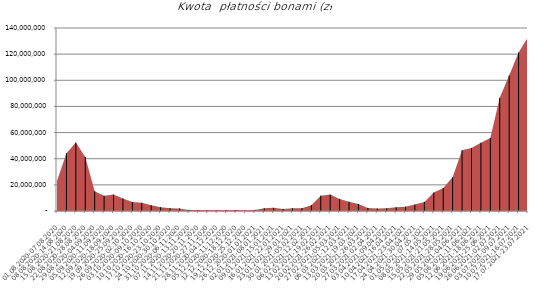
| Category | Kwota płatności bonami (zł) |
|---|---|
| 01.08.2020-07.08.2020 | 22962396.11 |
| 08.08.2020-14.08.2020 | 44134317.06 |
| 15.08.2020-21.08.2020 | 52334816.93 |
| 22.08.2020-28.08.2020 | 41223224.44 |
| 29.08.2020-04.09.2020 | 15089118.73 |
| 05.09.2020-11.09.2020 | 11625392.1 |
| 12.09.2020-18.09.2020 | 12529523.18 |
| 19.09.2020-25.09.2020 | 9513473.35 |
| 26.09.2020-02.10.2020 | 6916961.06 |
| 03.10.2020-09.10.2020 | 6297642.74 |
| 10.10.2020-16.10.2020 | 4393968.33 |
| 17.10.2020-23.10.2020 | 2928968.04 |
| 24.10.2020-30.10.2020 | 2163868.86 |
| 31.10.2020-06.11.2020 | 1954231.13 |
| 07.11.2020-13.11.2020 | 767949.47 |
| 14.11.2020-20.11.2020 | 682235.13 |
| 21.11.2020-27.11.2020 | 530240.71 |
| 28.11.2020-04.12.2020 | 497207.4 |
| 05.12.2020-11.12.2020 | 562022.92 |
| 12.12.2020-18.12.2020 | 725485.9 |
| 19.12.2020-25.12.2020 | 465771.62 |
| 26.12.2020-01.01.2021 | 858701.02 |
| 02.01.2021-08.01.2021 | 2036677.78 |
| 09.01.2021-15.01.2021 | 2411692.13 |
| 16.01.2021-22.01.2021 | 1614054.32 |
| 23.01.2021-29.01.2021 | 2094181.62 |
| 30.01.2021-05.02.2021 | 2198351.66 |
| 06.02.2021-12.02.2021 | 4451982.5 |
| 13.02.2021-19.02.2021 | 11707556.37 |
| 20.02.2021-26.02.2021 | 12556875.91 |
| 27.02.2021-05.03.2021 | 9198308.94 |
| 06.03.2021-12.03.2021 | 7080535.55 |
| 13.03.2021-19.03.2021 | 5414338.41 |
| 20.03.2021-26.03.2021 | 2364775.91 |
| 27.03.2021-02.04.2021 | 1844939.41 |
| 03.04.2021-09.04.2021 | 2037915.64 |
| 10.04.2021-16.04.2021 | 2807439.27 |
| 17.04.2021-23.04.2021 | 3345793.58 |
| 24.04.2021-30.04.2021 | 4963225.13 |
| 01.05.2021-07.05.2021 | 6953179.16 |
| 08.05.2021-14.05.2021 | 14126989.72 |
| 15.05.2021-21.05.2021 | 17520162.74 |
| 22.05.2021-28.05.2021 | 25767399.69 |
| 29.05.2021-04.06.2021 | 46475695.94 |
| 05.06.2021-11.06.2021 | 48188224.17 |
| 12.06.2021-18.06.2021 | 52161738.15 |
| 19.06.2021-25.06.2021 | 55783252.48 |
| 26.06.2021-02.07.2021 | 86548704.69 |
| 03.07.2021-09.07.2021 | 103742845.68 |
| 10.07.2021-16.07.2021 | 121211534.33 |
| 17.07.2021-23.07.2021 | 133061256.08 |